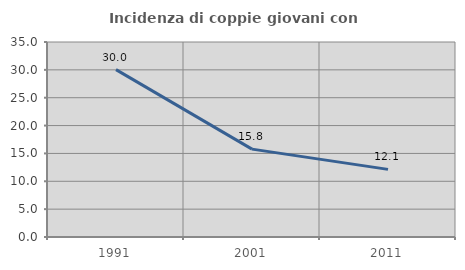
| Category | Incidenza di coppie giovani con figli |
|---|---|
| 1991.0 | 30.039 |
| 2001.0 | 15.774 |
| 2011.0 | 12.141 |